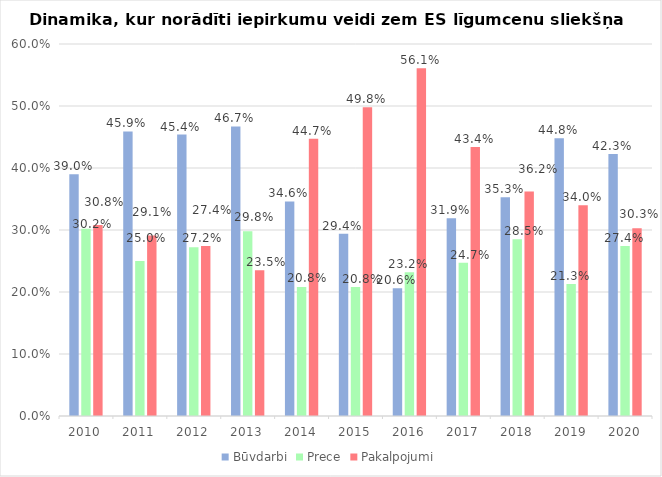
| Category | Būvdarbi | Prece | Pakalpojumi |
|---|---|---|---|
| 2010.0 | 0.39 | 0.302 | 0.308 |
| 2011.0 | 0.459 | 0.25 | 0.291 |
| 2012.0 | 0.454 | 0.272 | 0.274 |
| 2013.0 | 0.467 | 0.298 | 0.235 |
| 2014.0 | 0.346 | 0.208 | 0.447 |
| 2015.0 | 0.294 | 0.208 | 0.498 |
| 2016.0 | 0.206 | 0.232 | 0.561 |
| 2017.0 | 0.319 | 0.247 | 0.434 |
| 2018.0 | 0.353 | 0.285 | 0.362 |
| 2019.0 | 0.448 | 0.213 | 0.34 |
| 2020.0 | 0.423 | 0.274 | 0.303 |